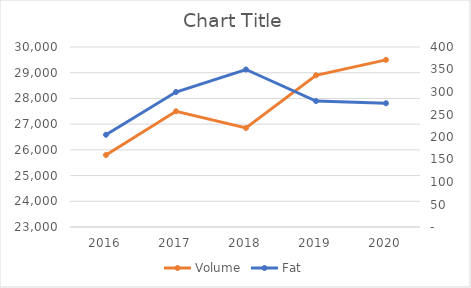
| Category | Volume |
|---|---|
| 2016.0 | 25800 |
| 2017.0 | 27500 |
| 2018.0 | 26850 |
| 2019.0 | 28900 |
| 2020.0 | 29500 |